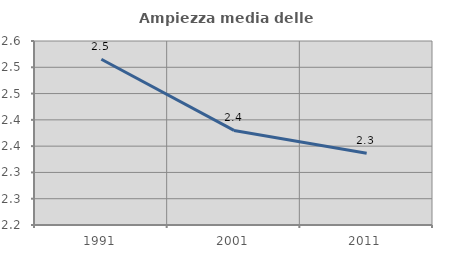
| Category | Ampiezza media delle famiglie |
|---|---|
| 1991.0 | 2.515 |
| 2001.0 | 2.38 |
| 2011.0 | 2.337 |